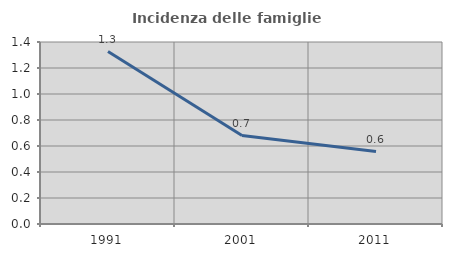
| Category | Incidenza delle famiglie numerose |
|---|---|
| 1991.0 | 1.327 |
| 2001.0 | 0.68 |
| 2011.0 | 0.557 |